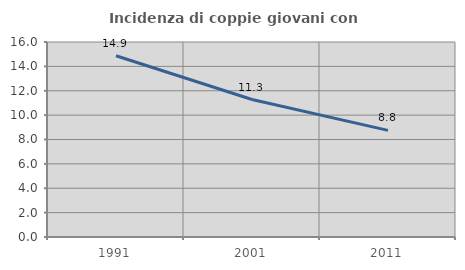
| Category | Incidenza di coppie giovani con figli |
|---|---|
| 1991.0 | 14.873 |
| 2001.0 | 11.282 |
| 2011.0 | 8.75 |